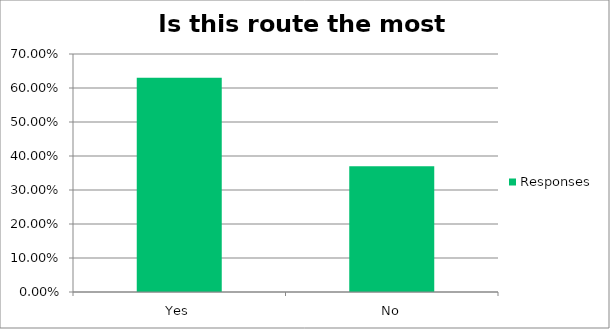
| Category | Responses |
|---|---|
| Yes | 0.63 |
| No | 0.37 |